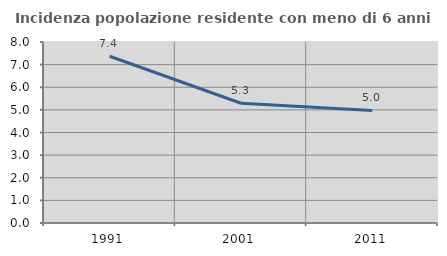
| Category | Incidenza popolazione residente con meno di 6 anni |
|---|---|
| 1991.0 | 7.37 |
| 2001.0 | 5.294 |
| 2011.0 | 4.973 |